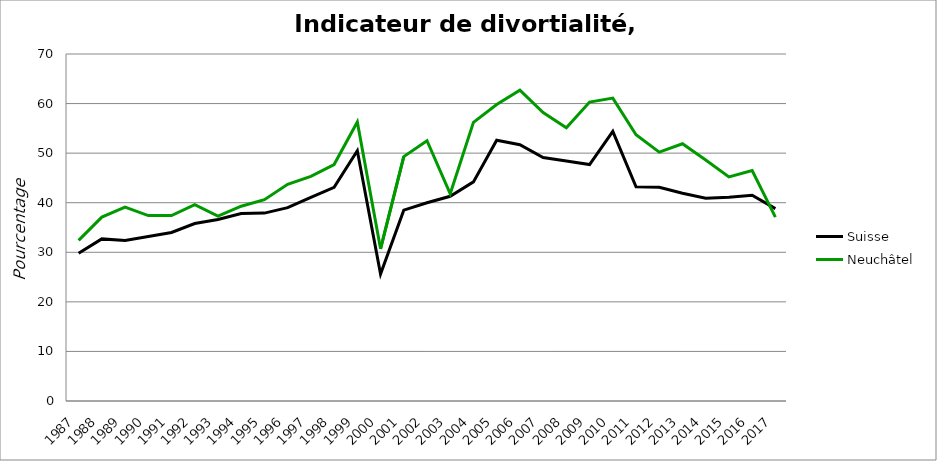
| Category | Suisse  | Neuchâtel  |
|---|---|---|
| 1987.0 | 29.8 | 32.4 |
| 1988.0 | 32.7 | 37.1 |
| 1989.0 | 32.4 | 39.1 |
| 1990.0 | 33.2 | 37.4 |
| 1991.0 | 34 | 37.4 |
| 1992.0 | 35.8 | 39.6 |
| 1993.0 | 36.6 | 37.3 |
| 1994.0 | 37.8 | 39.3 |
| 1995.0 | 37.9 | 40.6 |
| 1996.0 | 39 | 43.7 |
| 1997.0 | 41.1 | 45.3 |
| 1998.0 | 43.1 | 47.7 |
| 1999.0 | 50.5 | 56.3 |
| 2000.0 | 25.6 | 30.7 |
| 2001.0 | 38.5 | 49.3 |
| 2002.0 | 40 | 52.5 |
| 2003.0 | 41.3 | 41.8 |
| 2004.0 | 44.2 | 56.2 |
| 2005.0 | 52.6 | 59.8 |
| 2006.0 | 51.7 | 62.7 |
| 2007.0 | 49.1 | 58.2 |
| 2008.0 | 48.4 | 55.1 |
| 2009.0 | 47.7 | 60.3 |
| 2010.0 | 54.4 | 61.1 |
| 2011.0 | 43.2 | 53.7 |
| 2012.0 | 43.1 | 50.2 |
| 2013.0 | 41.9 | 51.9 |
| 2014.0 | 40.9 | 48.6 |
| 2015.0 | 41.1 | 45.2 |
| 2016.0 | 41.5 | 46.5 |
| 2017.0 | 38.8 | 37.1 |